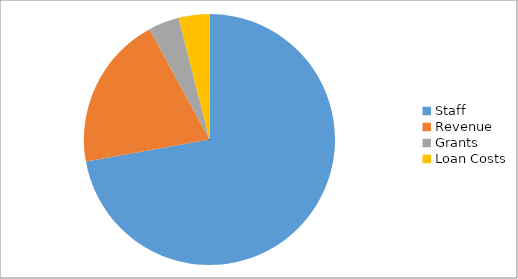
| Category | Series 0 |
|---|---|
| Staff | 272950 |
| Revenue | 75120 |
| Grants | 15000 |
| Loan Costs | 14960 |